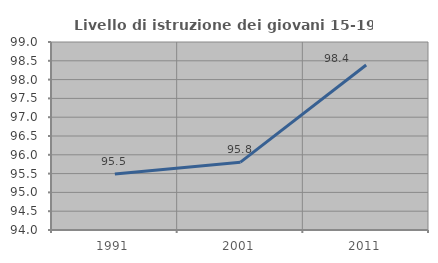
| Category | Livello di istruzione dei giovani 15-19 anni |
|---|---|
| 1991.0 | 95.489 |
| 2001.0 | 95.804 |
| 2011.0 | 98.387 |